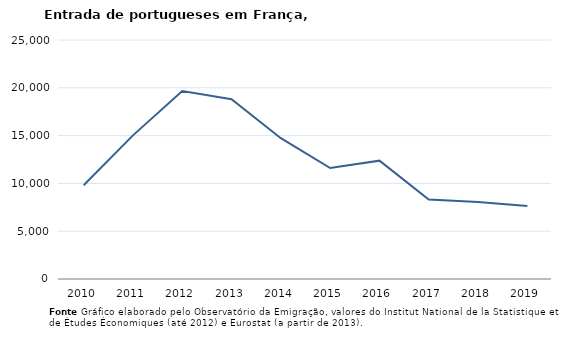
| Category | Entradas |
|---|---|
| 2010.0 | 9801 |
| 2011.0 | 15023 |
| 2012.0 | 19658 |
| 2013.0 | 18803 |
| 2014.0 | 14732 |
| 2015.0 | 11607 |
| 2016.0 | 12377 |
| 2017.0 | 8314 |
| 2018.0 | 8047 |
| 2019.0 | 7643 |